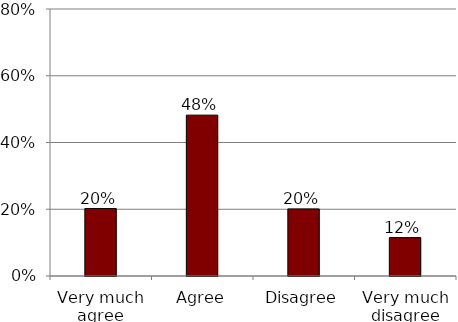
| Category | 0 |
|---|---|
| Very much agree | 0.202 |
| Agree | 0.482 |
| Disagree | 0.201 |
| Very much disagree | 0.115 |